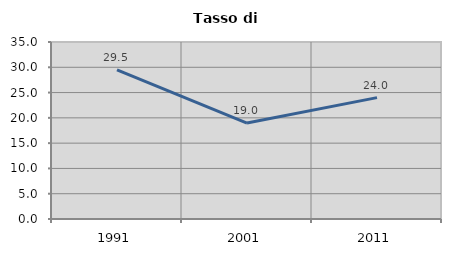
| Category | Tasso di disoccupazione   |
|---|---|
| 1991.0 | 29.474 |
| 2001.0 | 18.966 |
| 2011.0 | 24 |